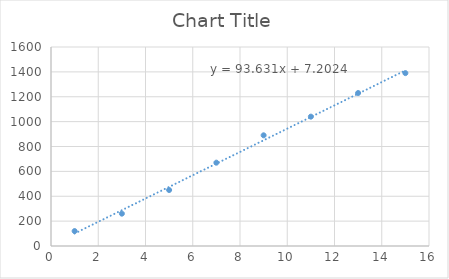
| Category | Series 0 |
|---|---|
| 1.0 | 120 |
| 3.0 | 260 |
| 5.0 | 450 |
| 7.0 | 670 |
| 9.0 | 890 |
| 11.0 | 1040 |
| 13.0 | 1230 |
| 15.0 | 1390 |